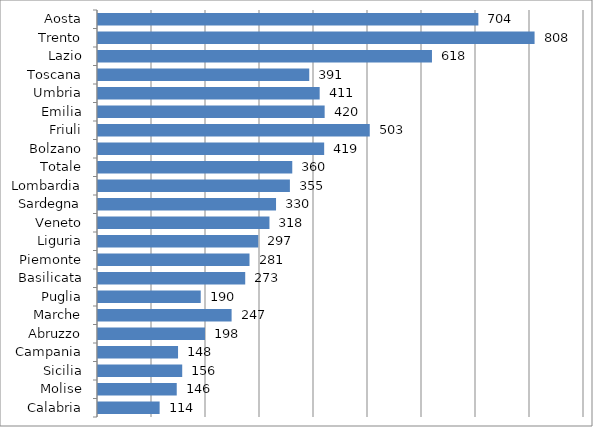
| Category | Series 0 |
|---|---|
| Aosta | 704.379 |
| Trento | 808.468 |
| Lazio | 618.463 |
| Toscana | 391.192 |
| Umbria | 410.508 |
| Emilia | 419.721 |
| Friuli | 503.242 |
| Bolzano | 418.833 |
| Totale | 359.761 |
| Lombardia | 355.374 |
| Sardegna | 329.708 |
| Veneto | 317.52 |
| Liguria | 296.744 |
| Piemonte | 280.583 |
| Basilicata | 272.625 |
| Puglia | 190.243 |
| Marche | 247.415 |
| Abruzzo | 198.12 |
| Campania | 148.231 |
| Sicilia | 155.955 |
| Molise | 145.812 |
| Calabria | 114.136 |